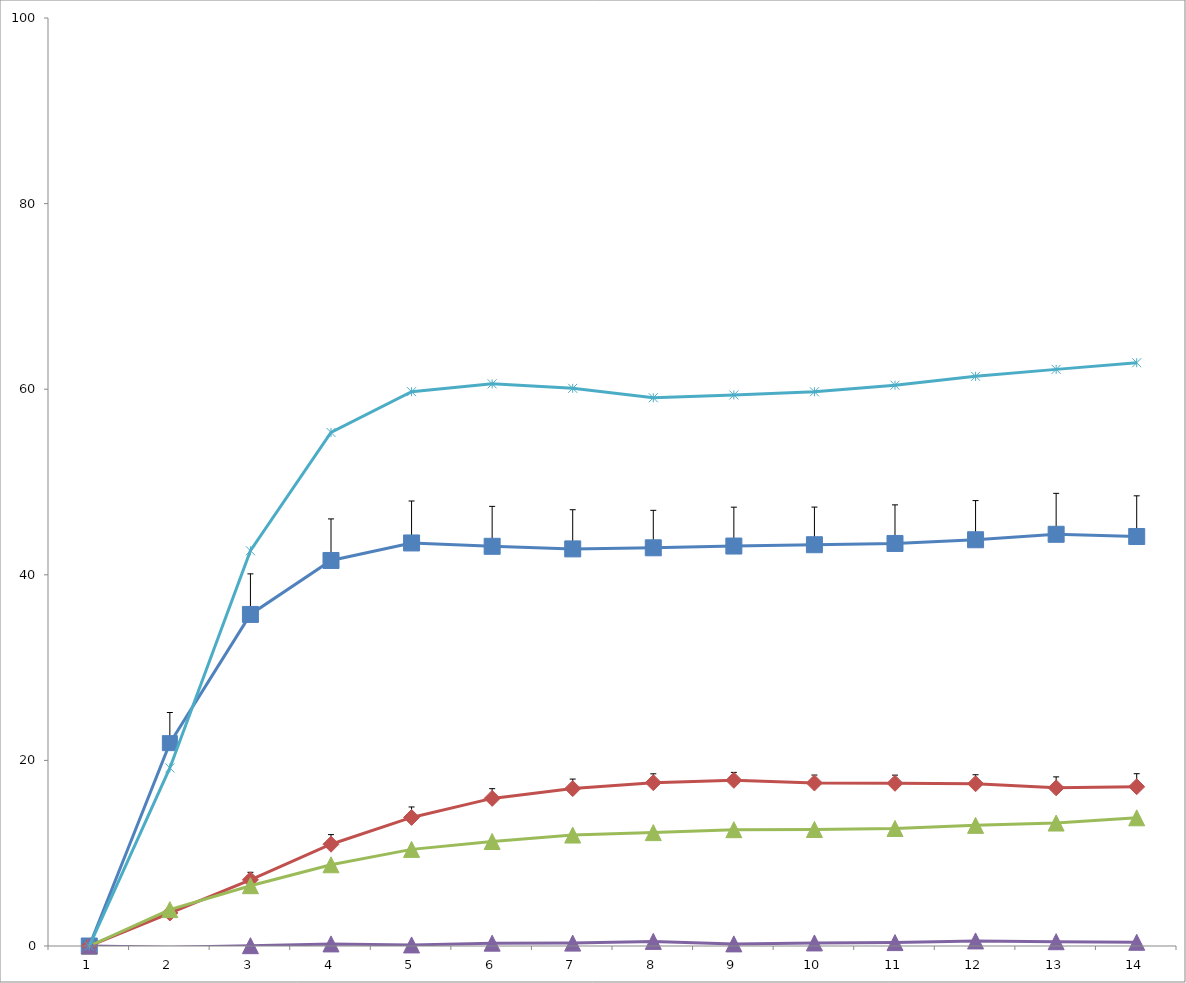
| Category | Series 0 | Series 1 | Series 2 | Series 3 | 5HTSENS |
|---|---|---|---|---|---|
| 0 | 0 | 0 | 0 | 0 | 0 |
| 1 | 21.859 | 3.556 | 3.92 | -0.14 | 19.189 |
| 2 | 35.73 | 7.131 | 6.498 | 0.034 | 42.592 |
| 3 | 41.544 | 10.965 | 8.753 | 0.225 | 55.337 |
| 4 | 43.431 | 13.855 | 10.412 | 0.116 | 59.731 |
| 5 | 43.071 | 15.906 | 11.261 | 0.304 | 60.576 |
| 6 | 42.792 | 16.963 | 11.955 | 0.311 | 60.092 |
| 7 | 42.908 | 17.599 | 12.219 | 0.497 | 59.076 |
| 8 | 43.1 | 17.855 | 12.532 | 0.227 | 59.376 |
| 9 | 43.241 | 17.566 | 12.554 | 0.33 | 59.718 |
| 10 | 43.378 | 17.536 | 12.666 | 0.368 | 60.43 |
| 11 | 43.777 | 17.489 | 13 | 0.547 | 61.39 |
| 12 | 44.366 | 17.043 | 13.25 | 0.463 | 62.136 |
| 13 | 44.127 | 17.163 | 13.813 | 0.4 | 62.852 |